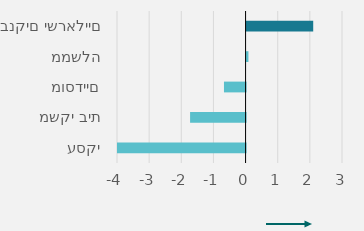
| Category | Series 0 |
|---|---|
| 0 | -4021.326 |
| 1 | -1726 |
| 2 | -672.223 |
| 3 | 58 |
| 4 | 2073.294 |